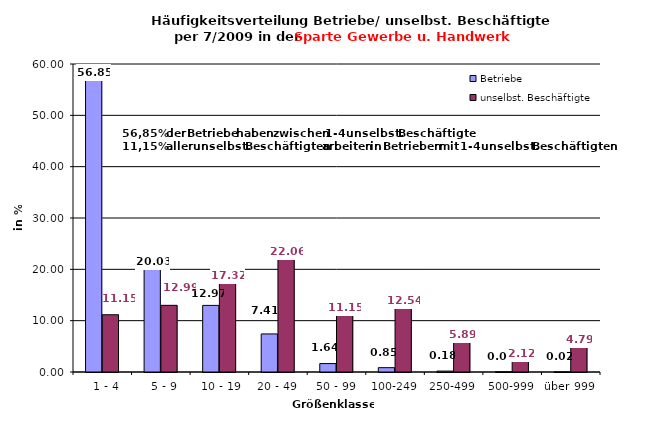
| Category | Betriebe | unselbst. Beschäftigte |
|---|---|---|
|   1 - 4 | 56.853 | 11.15 |
|   5 - 9 | 20.029 | 12.985 |
|  10 - 19 | 12.974 | 17.325 |
| 20 - 49 | 7.413 | 22.057 |
| 50 - 99 | 1.642 | 11.152 |
| 100-249 | 0.845 | 12.537 |
| 250-499 | 0.179 | 5.885 |
| 500-999 | 0.041 | 2.116 |
| über 999 | 0.024 | 4.794 |